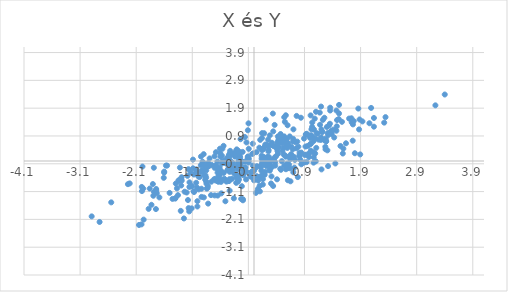
| Category | y:=F_(Y|x)^(-1)(rand) |
|---|---|
| 0.5896275634621583 | -0.095 |
| -2.752602820684224 | -2.193 |
| -0.4389186204987498 | -0.073 |
| -1.7437644833656527 | -1.008 |
| 0.45797332733387397 | 0.908 |
| -0.5427664055764372 | 0.544 |
| -1.0186077017477941 | -0.419 |
| -0.30015365867561106 | -0.508 |
| -0.02041116718455496 | -0.165 |
| 2.0876987020938196 | 1.909 |
| 0.44435475127766777 | 0.72 |
| -0.647376511549271 | -1.243 |
| -1.8782972489453043 | -1.722 |
| -1.3055441266316576 | -1.794 |
| 0.19032965161871257 | -0.497 |
| -0.6648660665365234 | -0.261 |
| -0.8510971066152488 | -0.234 |
| 0.23051776144464453 | -0.095 |
| -0.8022914525680538 | -0.183 |
| 1.567866195908032 | 1.409 |
| -1.9978318400646504 | -1.083 |
| 1.0904345833698474 | 0.27 |
| -0.6235717414790808 | -0.508 |
| 1.582826895527808 | 0.269 |
| 0.8248374868925409 | 0.049 |
| 1.4755965757373275 | 1.247 |
| -0.7115459837609892 | -0.656 |
| -1.0090279265437971 | -1.636 |
| 0.6455200179774345 | 0.064 |
| 1.104518708989608 | 1.771 |
| -0.6016423944191462 | 0.282 |
| 0.5083703959355064 | 0.365 |
| 0.5987705670993946 | 1.286 |
| -0.1333792165721945 | -0.393 |
| -0.39048689223544386 | -0.639 |
| 0.43344820482119534 | 0.631 |
| 0.5988795131223004 | 0.597 |
| 0.4361408995673678 | 0.768 |
| -0.4984132465425301 | -0.093 |
| -0.7910780109254609 | 0.093 |
| 0.13570647199953134 | 0.088 |
| 0.9995547233196936 | 0.6 |
| -0.9045520811865772 | -0.062 |
| -0.626666122410485 | -0.526 |
| -0.2025768415130865 | 0.327 |
| -0.23939478062383876 | 0.784 |
| -0.816885957771107 | -0.069 |
| 0.7010618827625984 | -0.406 |
| 0.7551924215867654 | 0.457 |
| 0.3661537255372694 | 0.123 |
| 0.42774845238086456 | 0.262 |
| -0.1980272517631855 | -1.376 |
| 0.2015778791458013 | 0.593 |
| -0.30614680239790937 | -0.223 |
| 1.0908694593589077 | 0.807 |
| -0.2165283157918122 | -0.907 |
| -0.5084752669434824 | -0.686 |
| -1.1666402970104537 | -0.294 |
| 0.3429241190237627 | 1.066 |
| -0.29240524967897874 | 0.282 |
| 0.6653131644168337 | 0.513 |
| 0.4739241072676663 | 0.971 |
| 1.5927921034131227 | 0.445 |
| -1.7482144067682919 | -1.729 |
| -0.3377776583915118 | 0.158 |
| -0.6570915976151738 | -0.711 |
| -0.9478353859671523 | -0.152 |
| -1.0257778918036782 | -0.403 |
| 0.13582983695824444 | 0.194 |
| 0.30420176347379174 | -0.808 |
| -1.1547836675281182 | -1.812 |
| 0.923459681291617 | 0.961 |
| -0.099258380554169 | -0.051 |
| 0.8103951020255166 | 0.203 |
| -1.68698450724596 | -1.309 |
| -0.43402385540250565 | -1.065 |
| -0.30769962534443507 | 0.418 |
| -0.634937554467815 | -0.748 |
| -0.21271840269264344 | -0.043 |
| -0.9450378748684327 | 0.162 |
| -1.3218566737099 | -0.674 |
| 0.7025349460710991 | 1.139 |
| 1.3205553660913218 | -0.184 |
| 0.1945417404227064 | 0.018 |
| 1.0212037203853213 | 0.925 |
| -0.3592245629208416 | -1.343 |
| -1.6006547651063112 | -0.382 |
| 1.2751219422848623 | 0.421 |
| -0.6497813230593729 | -0.418 |
| 1.3854151019726335 | 0.973 |
| -1.9739865008419144 | -0.993 |
| 0.07508192489270955 | -0.703 |
| -0.9165561355590658 | -0.025 |
| 0.624112454116562 | -0.13 |
| -1.2490317076625435 | -2.066 |
| -0.276221489979151 | -0.173 |
| -0.1411799318222055 | -0.663 |
| -0.4299277716860685 | -0.215 |
| 0.538981758378969 | 0.828 |
| -0.3554420642807647 | -0.444 |
| -0.4457260688985811 | -0.723 |
| -1.2974493044643693 | -0.881 |
| 0.4959548603995352 | -0.004 |
| 0.4105555758639854 | -0.659 |
| -0.47520328366835046 | -0.33 |
| 1.7981677380662169 | 0.279 |
| 0.36775911865985983 | 1.298 |
| -0.30969475069371316 | -0.517 |
| -0.4255378477615096 | 0.365 |
| 0.41743827205362544 | 0.675 |
| 1.117675537991143 | 0.997 |
| -1.200361267805794 | -1.133 |
| -0.9302919590926221 | -0.332 |
| -2.893526176727706 | -1.991 |
| -0.9359938778844504 | -1.291 |
| 1.4291514945694217 | 0.845 |
| 0.5786277735073101 | 0.781 |
| -1.1514707330804703 | -0.933 |
| 0.1538044293480481 | -0.129 |
| -0.5723202143884804 | 0.192 |
| 0.13578154952331076 | -0.125 |
| -0.5714276188503744 | -0.091 |
| 0.6089453617044647 | 0.639 |
| -1.6085309900320253 | -0.606 |
| 0.10930366707363115 | -0.193 |
| -0.6155653603652615 | -0.72 |
| -1.0169893332383038 | -0.954 |
| -0.21830764501767916 | -0.488 |
| 0.94129359195009 | 0.979 |
| -0.682505319019657 | -0.703 |
| 0.6505642345876274 | -0.73 |
| -0.2456520868130811 | -0.199 |
| -2.2159539266986767 | -0.807 |
| -1.5695873735921893 | -0.164 |
| -0.04662453094157951 | -0.397 |
| 0.2712666500968409 | -0.154 |
| 0.2348266133316768 | 0.143 |
| -0.16159301967242123 | 0.862 |
| 0.14526001186418203 | -0.511 |
| 0.11102177718157498 | 0.76 |
| 0.9856614637059709 | 0.28 |
| -0.9691757179468734 | -0.578 |
| -0.2752030580338649 | 0.157 |
| 0.020691098795290845 | -0.273 |
| 0.0952043641043485 | 0.479 |
| 0.5272063542797648 | 0.235 |
| -0.8476394006915168 | -0.813 |
| 1.3578871445769 | 1.816 |
| 0.5981309341562376 | -0.261 |
| 0.5775090272890407 | 0.534 |
| -0.8172532933189708 | -1.532 |
| 1.4695867006616021 | 1.815 |
| -0.11244563851675138 | 0.093 |
| -0.8635967910528798 | -0.186 |
| 0.9873448796545176 | 0.914 |
| -1.601325985120084 | -0.419 |
| -0.986955605514626 | -1.022 |
| 1.1098688355175814 | 0.472 |
| -1.3208841909476188 | -0.239 |
| 1.0641021515068145 | 0.135 |
| 0.06735731335934189 | -1.012 |
| -0.3959942618808746 | -0.217 |
| -0.4362872059981804 | -0.683 |
| -0.2748618128387267 | 0.002 |
| 1.777572042359168 | 1.436 |
| 1.191442336260792 | 0.758 |
| 0.26047796269926177 | 0.394 |
| 1.0132272412566046 | 0.371 |
| 0.1435391108695524 | 1.002 |
| -0.4578048733215571 | -0.282 |
| -0.04296188265628681 | -0.573 |
| -0.8836854688910825 | -0.524 |
| -1.0092196003591885 | -1.445 |
| -0.49120625120857503 | -0.741 |
| 1.1770608582806772 | 1.303 |
| -0.2919433665874663 | -0.301 |
| 1.8596665171258229 | 1.886 |
| 0.22645594297431346 | 0.59 |
| 0.17013483405088378 | 0.148 |
| -0.28794214494217235 | -0.077 |
| 1.3650451936466217 | 1.047 |
| 0.033525717044863595 | -1.147 |
| 0.7125463779717867 | 0.15 |
| -0.44643418510353755 | 0.216 |
| 0.7596053138958623 | 1.622 |
| -0.06555314559451728 | -0.552 |
| 0.2569002373969561 | 0.345 |
| -0.3169740041116039 | -0.786 |
| -1.2376755832738167 | -1.104 |
| -0.2653114053263359 | -0.022 |
| 0.3770148865175738 | -0.043 |
| 1.7361537472245763 | 1.536 |
| 1.2848184320523814 | 0.717 |
| 0.5657577651912592 | 0.155 |
| -0.5982402429721405 | -0.449 |
| 0.5387594120332247 | 1.575 |
| -0.3178988933944237 | 0.369 |
| 2.3210514548090364 | 1.38 |
| -0.6410584329931398 | -0.263 |
| 1.323961232090124 | 0.936 |
| -0.842818969337798 | -0.993 |
| -0.36704743091837083 | -0.157 |
| -1.0774476875048502 | -1.089 |
| 0.3577344956183657 | 0.029 |
| -1.0307842338931485 | -0.783 |
| 0.636760637147189 | 0.884 |
| 0.5501231717379759 | 1.408 |
| 0.7422141240456205 | 0.675 |
| -1.345423237571591 | -0.698 |
| -1.290227072125841 | -0.584 |
| 0.49676206727741323 | 0.879 |
| 0.14175066429203878 | 0.823 |
| -0.6811806220867622 | -0.633 |
| -0.8507847954169947 | -0.337 |
| 0.20154089569893685 | 0.098 |
| -1.9880127095543552 | -0.2 |
| 1.335667253515416 | 1.277 |
| 0.04541710251528065 | 0.318 |
| 0.48029437970350464 | -0.316 |
| 0.9373619181505884 | -0.042 |
| 0.3220737422883913 | -0.213 |
| -0.032286753747716335 | 0.253 |
| 0.4980590776569501 | 0.647 |
| 0.2191325931071861 | -0.184 |
| -0.384023289279139 | -0.054 |
| -2.5448563890842406 | -1.487 |
| 0.15876123637112075 | -0.651 |
| 0.2849237059603305 | 0.559 |
| -0.9351646957161258 | -0.401 |
| -0.09475658853196192 | -0.011 |
| -0.8499676775246264 | -0.748 |
| 0.41857610845832166 | 0.359 |
| -0.1592812679215034 | -0.027 |
| -0.5823332057853495 | -1.164 |
| -0.8936285936916422 | -1.31 |
| 0.5391878881389391 | 0.885 |
| -0.8648059393492029 | -0.518 |
| -1.9670698933005655 | -2.109 |
| -1.8030854519231718 | -0.829 |
| -0.039084008703779496 | -0.393 |
| 0.33579964946050217 | 1.706 |
| 1.1330395427492324 | 0.984 |
| 0.3928297558312076 | 0.17 |
| 1.4502360267222325 | -0.089 |
| 1.0829927801802102 | 1.524 |
| 1.0381259870853075 | 1.384 |
| -0.10935389716445433 | 1.106 |
| 0.14288986812865212 | 0.387 |
| 1.2793196722283073 | 0.803 |
| -1.0872648849352449 | 0.05 |
| -0.8972297187434604 | 0.246 |
| -1.8585270758687755 | -0.991 |
| -1.1279058987263009 | -0.414 |
| 0.5687923651688006 | -0.296 |
| -2.0050515790261185 | -2.279 |
| 1.468735505222516 | 1.088 |
| -0.24710332448156647 | 0.138 |
| -0.3898256449299173 | -0.289 |
| 0.09955778836177401 | -0.898 |
| -0.7024023416847418 | -0.245 |
| 1.8933238106675925 | 0.237 |
| 0.7286502905500496 | 0.04 |
| -0.2552018237802963 | 0.185 |
| -1.3736257419290967 | -0.984 |
| 0.6954881357032431 | 0.701 |
| 0.2850960771415775 | -0.064 |
| 0.5944871802579481 | 0.47 |
| -2.0496530690934396 | -2.301 |
| 1.3531930149331037 | 1.34 |
| -1.7424018923919957 | -1.059 |
| 0.6920503883128205 | 0.422 |
| -0.38194033893581925 | -0.314 |
| 1.062030042078512 | 0.717 |
| -2.247452205910276 | -0.833 |
| 0.2789886047504265 | -0.3 |
| -0.19743911138775025 | -1.413 |
| -1.185860193472724 | -0.533 |
| -0.1757633664979614 | -0.348 |
| -1.1116131986579558 | -1.704 |
| -1.0280904102372428 | -0.3 |
| 0.9045545005939196 | 0.218 |
| 1.0618460536879362 | -0.06 |
| -0.701165628597649 | -1.237 |
| 1.3084007397827553 | 0.383 |
| -0.0010175284946372883 | -0.357 |
| 1.5159508525855658 | 2.018 |
| -0.2868086024493788 | -0.658 |
| 1.009469305481345 | 1.64 |
| -0.26758029811399814 | -0.668 |
| -0.6789065959805083 | 0.316 |
| 0.2629597695943543 | 0.153 |
| -1.4046778870138537 | -1.351 |
| 0.5767360991322533 | 0.633 |
| -1.0683096168918513 | -1.116 |
| 0.7911168814465322 | 0.514 |
| 0.16750979687502093 | 0.43 |
| 0.25207122420671524 | 0.771 |
| -1.086658405560198 | -0.263 |
| 0.719906298797708 | -0.239 |
| -0.01376297161959542 | 0.275 |
| 0.20944330129243258 | 1.487 |
| 0.18087624638095193 | 0.999 |
| -0.43457815455402093 | 0.04 |
| 1.2032930138287385 | -0.302 |
| -0.22473018450135168 | 0.007 |
| -0.2555963722795205 | 0.004 |
| 0.1969405998025774 | 0.538 |
| -0.09371209967509114 | 0.438 |
| 0.2821141033840724 | 0.922 |
| 0.7810852454207358 | -0.579 |
| 1.7423175851617945 | 1.388 |
| -0.09104424676609311 | 0.08 |
| -0.653283640092674 | -0.021 |
| 0.25484596185182506 | 0.06 |
| 0.5673735837933466 | 1.645 |
| 1.0501222204733618 | 0.851 |
| -0.16142846920828036 | -0.28 |
| 1.5111690355453355 | 1.508 |
| 0.42614680656418535 | 0.883 |
| 1.3785654911257372 | 1.082 |
| -0.8525972808757899 | -0.598 |
| -0.19225738760371067 | -0.247 |
| 1.0242040433481456 | 1.137 |
| 0.699208739351617 | 0.795 |
| -0.8255610527173071 | -0.961 |
| -1.504221095175733 | -1.148 |
| 1.8729929046888039 | 1.136 |
| 0.12344883855307394 | -0.224 |
| 1.5160382669586137 | 1.71 |
| -0.5321776940589579 | -0.007 |
| 0.44250688100802243 | 0.494 |
| 0.38017124770835115 | 0.522 |
| -0.3099388809374875 | -0.582 |
| 0.8953274136319818 | -0.055 |
| -1.0713581039818019 | -0.486 |
| -0.40966758803764425 | 0.215 |
| 0.5273232118648825 | 0.478 |
| -1.7853598247378113 | -0.243 |
| -0.23324880470226012 | -0.063 |
| -0.5571057389909172 | 0.013 |
| -0.936231500948231 | -0.997 |
| -0.8234569691058878 | -0.893 |
| 0.8432205849488992 | -0.119 |
| 0.10600580500782786 | -0.559 |
| -0.2804425235310513 | -0.593 |
| 0.4015915931149105 | 0.458 |
| -0.13406151991728987 | 0.667 |
| -0.2830965549761093 | -0.736 |
| -1.3554703335054037 | -1.228 |
| 0.8125803535750108 | 0.293 |
| 1.2271986773464942 | 1.478 |
| -0.7530860780957068 | -0.141 |
| -0.24115717945706522 | -0.294 |
| 1.1012176482441107 | -0.011 |
| 1.1519479594296562 | 0.767 |
| 3.233571615490283 | 2.002 |
| -0.599469869780985 | 0.159 |
| 1.0602891976997135 | 0.313 |
| -0.1085593838561667 | 0.132 |
| -0.39856815725583095 | -0.049 |
| -1.4525024454456623 | -1.363 |
| -0.6877839961100222 | -0.165 |
| -0.27721548197505136 | 0.361 |
| -0.5873991189387925 | -0.751 |
| 1.195305331680455 | 1.958 |
| -0.37941227007859235 | 0.263 |
| -0.43399383687066195 | 0.263 |
| 1.287524463508481 | 0.706 |
| -0.5304215802751789 | -0.635 |
| -1.1657629328125831 | -1.694 |
| -1.1055380818365903 | -0.903 |
| 0.15747247262721115 | -0.846 |
| 0.049598000463083325 | -0.547 |
| 0.4841971915810987 | 0.775 |
| 1.541576912650391 | 0.54 |
| 0.3775402694208945 | -0.165 |
| 0.46766021729134727 | -0.278 |
| 0.5395013088916473 | -0.168 |
| -0.6216563017484791 | -0.679 |
| 1.172096941712998 | 1.74 |
| -0.15176999212584324 | -0.23 |
| 1.4129612552042556 | 1.128 |
| 0.42625473932420155 | 0.484 |
| 0.8429746782729235 | 0.303 |
| -0.9902794490880504 | -0.56 |
| 1.9329415269892751 | 1.424 |
| 2.0573606355467775 | 1.358 |
| 1.2988321232258517 | 1.223 |
| 1.1971127282911114 | 0.847 |
| 0.9316952974293766 | 0.229 |
| 0.17530651016106602 | -0.007 |
| 1.6394117315927823 | 0.637 |
| -0.6072885793201445 | 0.442 |
| 3.400421045534634 | 2.392 |
| -6.821992641883883e-07 | -0.695 |
| 0.6620751874326402 | 0.247 |
| 1.3145818202961128 | 1.005 |
| -0.48783087123179725 | 0.096 |
| 0.34690335715298726 | 0.537 |
| -1.2884808141258481 | -0.706 |
| 1.3581599104208695 | 1.917 |
| 0.8917637247856279 | 0.806 |
| -0.7038838980728033 | 0.168 |
| 0.2820973265819618 | -0.345 |
| 0.97961314086764 | 0.145 |
| -1.5493384105342038 | -0.165 |
| 1.202617449658401 | 1.137 |
| 1.2128256836236337 | 1.053 |
| -0.4105242178967393 | -0.262 |
| 0.1464490369570414 | -0.044 |
| -1.7333567233415834 | -1.156 |
| -0.6134448436043046 | -0.237 |
| -0.021703491791709138 | 0.623 |
| 0.8108594098072974 | 0.166 |
| -1.2977145761252344 | -0.667 |
| 0.9278529298734727 | 0.947 |
| 1.7597359950205753 | 0.731 |
| -0.5819816771491351 | -0.365 |
| 1.2195587917299606 | 1.045 |
| -0.11033933545323939 | 0.161 |
| 0.5520837812501878 | 0.204 |
| 0.9992979822596462 | 0.831 |
| 1.0700650175314548 | 1.13 |
| 0.7725046246714254 | 0.697 |
| -0.435797168599758 | -0.652 |
| 1.695639939346566 | 1.526 |
| 0.604375057579773 | -0.692 |
| -1.399521935075043 | -1.336 |
| 2.1376133524949243 | 1.235 |
| 2.344358741845068 | 1.578 |
| 0.19987220637149558 | -0.39 |
| -0.7660131590185086 | -1.228 |
| -0.6735773154397665 | -0.159 |
| 0.1048653021554091 | -1.092 |
| 0.5826268780428329 | 0.678 |
| 1.4805458689096898 | 1.473 |
| -1.177198708992154 | -1.404 |
| 0.3200870107570994 | 0.655 |
| 0.31342457765675474 | 0.049 |
| 0.623163831143733 | 0.164 |
| -0.3511493977713925 | 0.277 |
| -1.1496786111832624 | -0.767 |
| 1.2558708317120644 | 0.743 |
| -0.5099797837538655 | -1.448 |
| 0.5438591586073372 | 0.659 |
| 1.8817199574545578 | 1.494 |
| 0.9561399365106695 | 0.539 |
| -2.00050984037018 | -0.933 |
| -0.7601633620628213 | -0.744 |
| -0.2619429550292551 | 0.255 |
| -0.586454829513104 | -0.667 |
| 0.16514892965265413 | 0.457 |
| 1.2547073476066695 | 1.555 |
| 0.31206458655307395 | -0.554 |
| 0.5833416420701416 | 0.795 |
| -0.5403155638700696 | -0.43 |
| -1.8279160309109843 | -1.575 |
| 0.34130519622750394 | -0.899 |
| 0.0044782478582972365 | -0.244 |
| -0.8704891149236212 | -0.671 |
| 0.050458330392139955 | -0.187 |
| 1.0361040993210715 | 1.226 |
| -0.4335471813529453 | -0.391 |
| -0.5628897017906842 | 0.441 |
| 2.1378017798404354 | 1.547 |
| 0.1509765582682882 | 0.033 |
| -0.9095905651271913 | -0.366 |
| -0.22839414027536908 | -1.363 |
| -1.7822303074814259 | -1.112 |
| -1.340743516852242 | -0.715 |
| -1.394027289527873 | -0.811 |
| 1.0195975624644176 | 0.63 |
| -0.8872172669949093 | -0.184 |
| 1.2716497826874111 | 0.512 |
| -0.19017624615032597 | -0.505 |
| 0.6399526756275856 | -0.261 |
| 0.13111692204021005 | -0.347 |
| 0.2431514110713718 | 0.557 |
| 0.9175957711502484 | 0.521 |
| 1.7641354623887862 | 1.316 |
| -1.794350272248972 | -1.249 |
| -0.09816058056186477 | 1.354 |
| 0.836692523521041 | 1.556 |